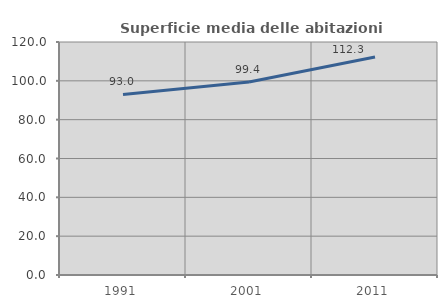
| Category | Superficie media delle abitazioni occupate |
|---|---|
| 1991.0 | 93.02 |
| 2001.0 | 99.352 |
| 2011.0 | 112.271 |